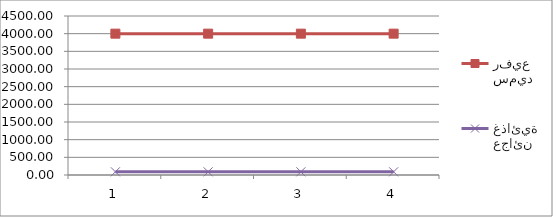
| Category | سميد رفيع | عجائن غذائية |
|---|---|---|
| 0 | 4000 | 90 |
| 1 | 4000 | 90 |
| 2 | 4000 | 90 |
| 3 | 4000 | 90 |